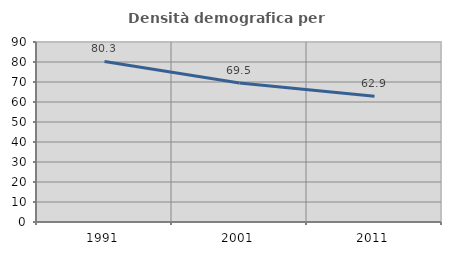
| Category | Densità demografica |
|---|---|
| 1991.0 | 80.277 |
| 2001.0 | 69.537 |
| 2011.0 | 62.892 |